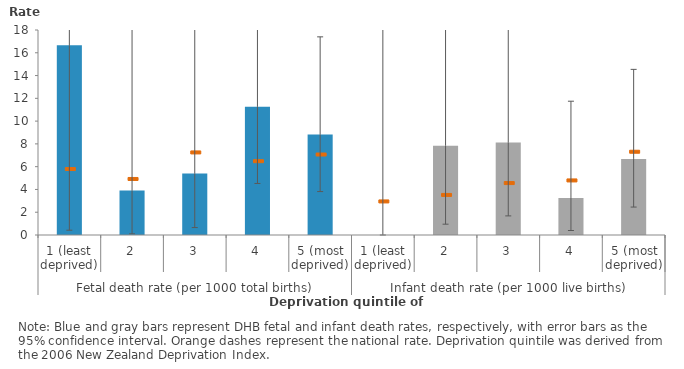
| Category | 1 |
|---|---|
| 0 | 16.667 |
| 1 | 3.906 |
| 2 | 5.391 |
| 3 | 11.254 |
| 4 | 8.83 |
| 5 | 0 |
| 6 | 7.843 |
| 7 | 8.13 |
| 8 | 3.252 |
| 9 | 6.682 |